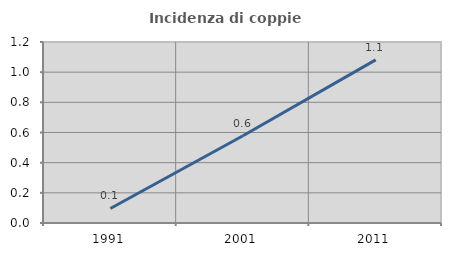
| Category | Incidenza di coppie miste |
|---|---|
| 1991.0 | 0.096 |
| 2001.0 | 0.579 |
| 2011.0 | 1.082 |